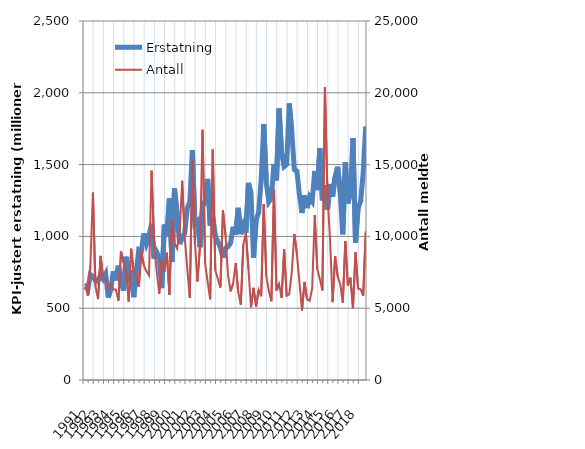
| Category | Erstatning |
|---|---|
| 1991.0 | 650.648 |
| nan | 629.43 |
| nan | 734.421 |
| nan | 721.938 |
| 1992.0 | 690.768 |
| nan | 686.357 |
| nan | 732.841 |
| nan | 703.455 |
| 1993.0 | 738.657 |
| nan | 573.657 |
| nan | 632.921 |
| nan | 757.464 |
| 1994.0 | 693.558 |
| nan | 795.624 |
| nan | 681.909 |
| nan | 622.598 |
| 1995.0 | 858.103 |
| nan | 725.295 |
| nan | 765.293 |
| nan | 577.138 |
| 1996.0 | 751.945 |
| nan | 908.415 |
| nan | 899.355 |
| nan | 1020.479 |
| 1997.0 | 949.161 |
| nan | 1003.74 |
| nan | 1088.191 |
| nan | 846 |
| 1998.0 | 891.248 |
| nan | 854.067 |
| nan | 640.093 |
| nan | 1082.595 |
| 1999.0 | 1003.069 |
| nan | 1263.121 |
| nan | 822.903 |
| nan | 1334.104 |
| 2000.0 | 1156.953 |
| nan | 946.831 |
| nan | 989.887 |
| nan | 1021.591 |
| 2001.0 | 1194.144 |
| nan | 1243.018 |
| nan | 1600.525 |
| nan | 1090.774 |
| 2002.0 | 1107.878 |
| nan | 924.647 |
| nan | 1206.522 |
| nan | 1247.951 |
| 2003.0 | 1400.268 |
| nan | 1074.864 |
| nan | 1134.634 |
| nan | 999.249 |
| 2004.0 | 963.726 |
| nan | 921.914 |
| nan | 852.553 |
| nan | 918.486 |
| 2005.0 | 928.439 |
| nan | 955.172 |
| nan | 1067.054 |
| nan | 1012.587 |
| 2006.0 | 1199.028 |
| nan | 1015.548 |
| nan | 1076.989 |
| nan | 1024.518 |
| 2007.0 | 1371.989 |
| nan | 1299.703 |
| nan | 851.519 |
| nan | 1113.965 |
| 2008.0 | 1166.754 |
| nan | 1395.909 |
| nan | 1782.351 |
| nan | 1373.023 |
| 2009.0 | 1239.722 |
| nan | 1265.696 |
| nan | 1504.367 |
| nan | 1389.958 |
| 2010.0 | 1890.587 |
| nan | 1582.148 |
| nan | 1485.47 |
| nan | 1499.799 |
| 2011.0 | 1925.715 |
| nan | 1727.709 |
| nan | 1466.19 |
| nan | 1455.486 |
| 2012.0 | 1289.19 |
| nan | 1163.089 |
| nan | 1285.325 |
| nan | 1197.586 |
| 2013.0 | 1274.225 |
| nan | 1245.98 |
| nan | 1455.531 |
| nan | 1322.905 |
| 2014.0 | 1613.943 |
| nan | 1251.164 |
| nan | 1357.353 |
| nan | 1184.708 |
| 2015.0 | 1364.912 |
| nan | 1275.895 |
| nan | 1416.944 |
| nan | 1484.685 |
| 2016.0 | 1310.689 |
| nan | 1014.193 |
| nan | 1516.078 |
| nan | 1229.613 |
| 2017.0 | 1307.073 |
| nan | 1684.101 |
| nan | 955.943 |
| nan | 1198.504 |
| 2018.0 | 1244.297 |
| nan | 1440.731 |
| nan | 1766.095 |